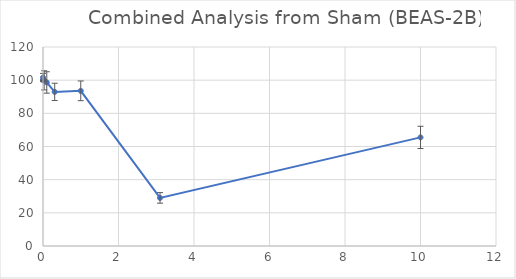
| Category | Combined Analysis from Sham (BEAS-2B) |
|---|---|
| 10.0 | 65.495 |
| 3.1 | 29.004 |
| 1.0 | 93.569 |
| 0.31 | 92.933 |
| 0.1 | 98.62 |
| 0.031 | 99.891 |
| 0.0 | 100 |
| 0.0 | 101.603 |